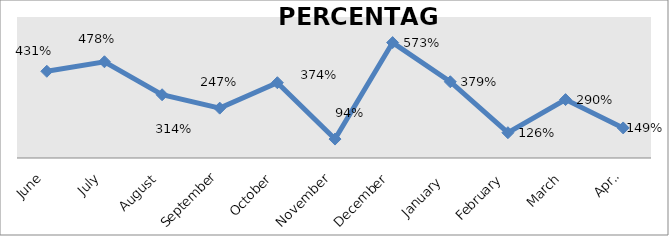
| Category | PERCENTAGE |
|---|---|
| June | 4.306 |
| July | 4.777 |
| August | 3.14 |
| September | 2.475 |
| October | 3.738 |
| November | 0.94 |
| December | 5.729 |
| January  | 3.785 |
| February | 1.255 |
| March | 2.899 |
| April | 1.493 |